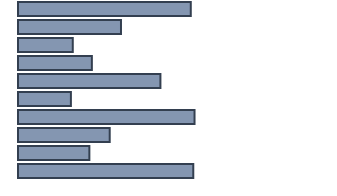
| Category | Percentatge |
|---|---|
| 0 | 55.2 |
| 1 | 32.9 |
| 2 | 17.5 |
| 3 | 23.6 |
| 4 | 45.5 |
| 5 | 16.9 |
| 6 | 56.4 |
| 7 | 29.3 |
| 8 | 22.8 |
| 9 | 56 |